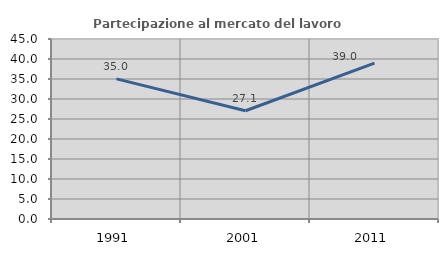
| Category | Partecipazione al mercato del lavoro  femminile |
|---|---|
| 1991.0 | 35.028 |
| 2001.0 | 27.059 |
| 2011.0 | 38.971 |